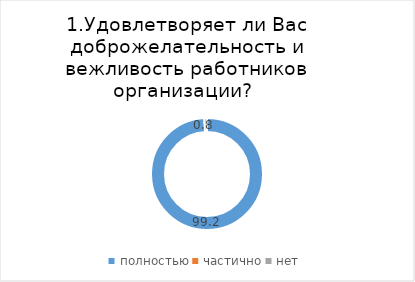
| Category | Бакчарский |
|---|---|
| полностью | 99.242 |
| частично | 0.758 |
| нет | 0 |